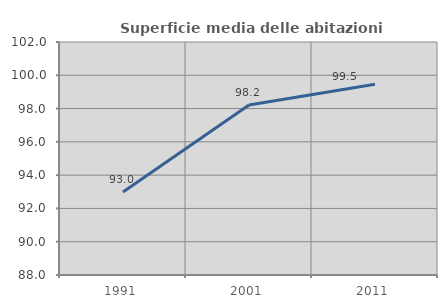
| Category | Superficie media delle abitazioni occupate |
|---|---|
| 1991.0 | 92.988 |
| 2001.0 | 98.214 |
| 2011.0 | 99.466 |